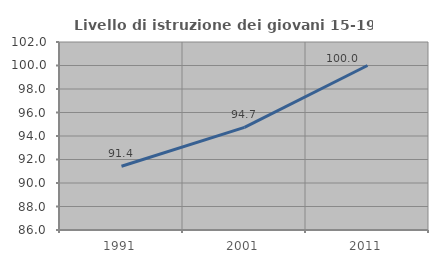
| Category | Livello di istruzione dei giovani 15-19 anni |
|---|---|
| 1991.0 | 91.429 |
| 2001.0 | 94.737 |
| 2011.0 | 100 |